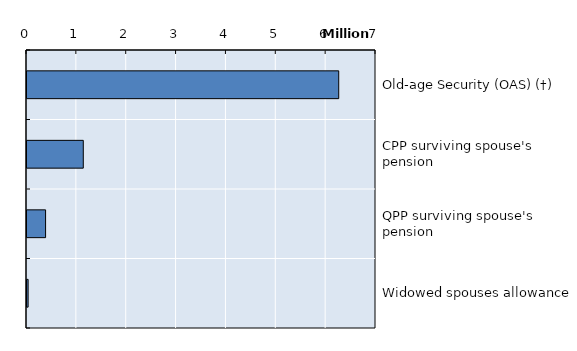
| Category | Series 0 |
|---|---|
| Old-age Security (OAS) (†) | 6252274 |
| CPP surviving spouse's pension | 1129004 |
| QPP surviving spouse's pension | 372663 |
| Widowed spouses allowance | 22386 |